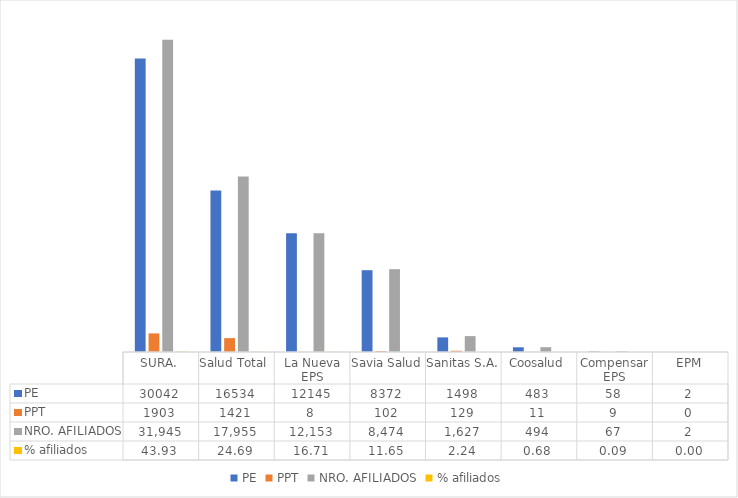
| Category | PE | PPT | NRO. AFILIADOS | % afiliados |
|---|---|---|---|---|
| SURA. | 30042 | 1903 | 31945 | 43.931 |
| Salud Total  | 16534 | 1421 | 17955 | 24.692 |
| La Nueva EPS | 12145 | 8 | 12153 | 16.713 |
| Savia Salud | 8372 | 102 | 8474 | 11.653 |
| Sanitas S.A. | 1498 | 129 | 1627 | 2.237 |
| Coosalud | 483 | 11 | 494 | 0.679 |
| Compensar EPS | 58 | 9 | 67 | 0.092 |
| EPM | 2 | 0 | 2 | 0.003 |